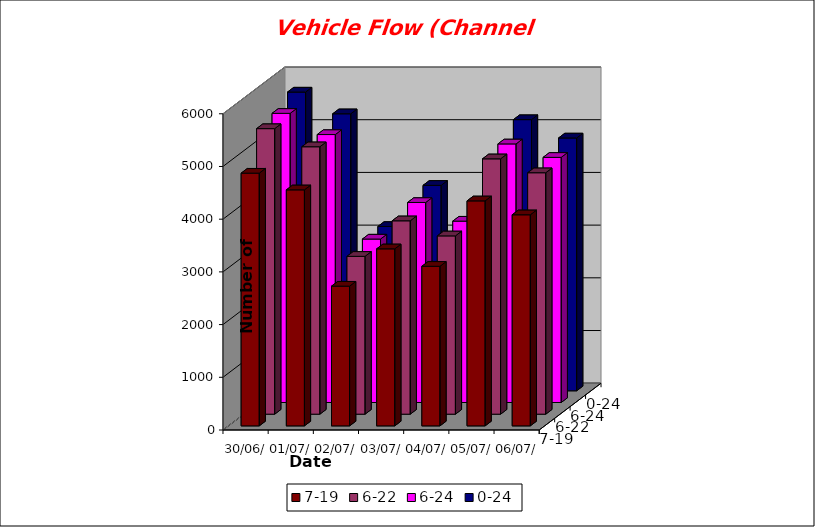
| Category | 7-19 | 6-22 | 6-24 | 0-24 |
|---|---|---|---|---|
| 30/06/2021 | 4795 | 5418 | 5486 | 5668 |
| 01/07/2021 | 4478 | 5074 | 5084 | 5256 |
| 02/07/2021 | 2651 | 2995 | 3101 | 3118 |
| 03/07/2021 | 3359 | 3669 | 3795 | 3898 |
| 04/07/2021 | 3028 | 3383 | 3441 | 3529 |
| 05/07/2021 | 4269 | 4845 | 4906 | 5145 |
| 06/07/2021 | 4005 | 4581 | 4651 | 4797 |